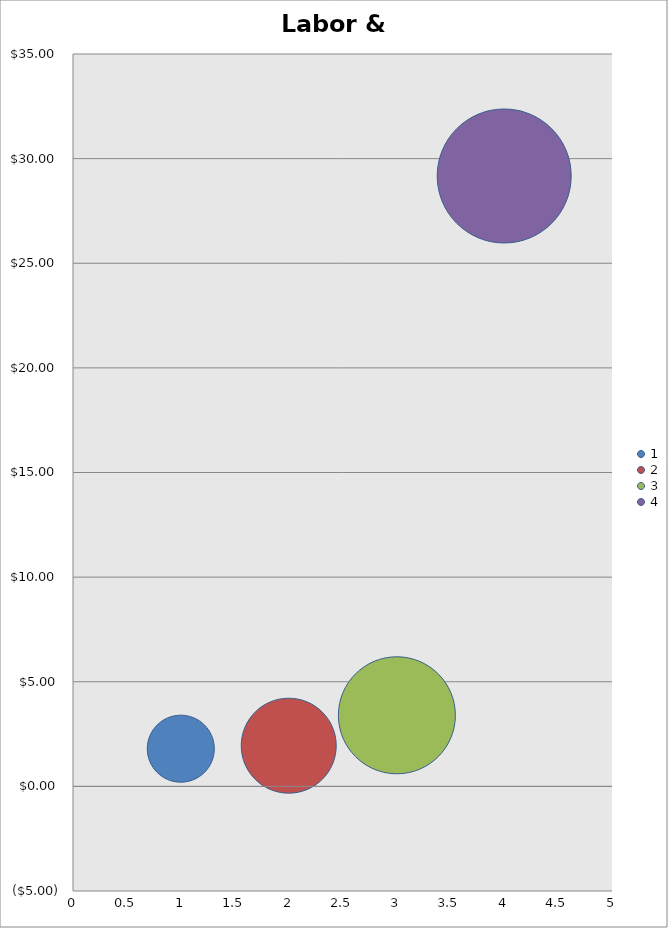
| Category | Labor & Overhead |
|---|---|
| 0 | 1.8 |
| 1 | 1.95 |
| 2 | 3.42 |
| 3 | 29.17 |